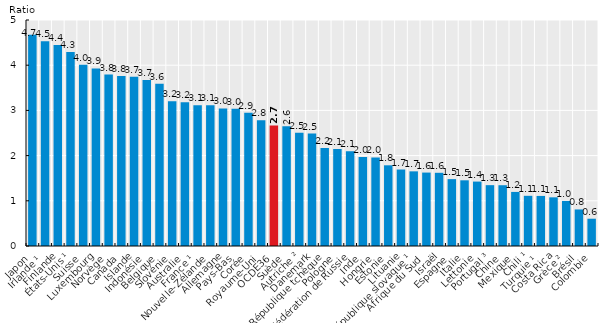
| Category | 2017 |
|---|---|
| Japon | 4.673 |
| Irlande ¹ | 4.531 |
| Finlande | 4.447 |
| États-Unis ¹ | 4.289 |
| Suisse | 4.008 |
| Luxembourg | 3.928 |
| Norvège | 3.792 |
| Canada | 3.759 |
| Islande | 3.743 |
| Indonésie | 3.67 |
| Belgique | 3.59 |
| Slovénie | 3.2 |
| Australie | 3.179 |
| France ¹ | 3.114 |
| Nouvelle-Zélande | 3.114 |
| Allemagne | 3.044 |
| Pays-Bas | 3.037 |
| Corée | 2.947 |
| Royaume-Uni | 2.784 |
| OCDE36 | 2.665 |
| Suède | 2.648 |
| Autriche ² | 2.505 |
| Danemark | 2.488 |
| République tchèque | 2.167 |
| Pologne | 2.145 |
| Fédération de Russie | 2.096 |
| Inde | 1.97 |
| Hongrie | 1.959 |
| Estonie | 1.785 |
| Lituanie | 1.692 |
| République slovaque ¹ | 1.652 |
| Afrique du Sud | 1.624 |
| Israël | 1.62 |
| Espagne | 1.48 |
| Italie | 1.453 |
| Lettonie | 1.425 |
| Portugal ³ | 1.346 |
| Chine | 1.345 |
| Mexique | 1.196 |
| Chili ¹ | 1.11 |
| Turquie ¹ | 1.108 |
| Costa Rica | 1.077 |
| Grèce ² | 0.997 |
| Brésil | 0.809 |
| Colombie | 0.604 |